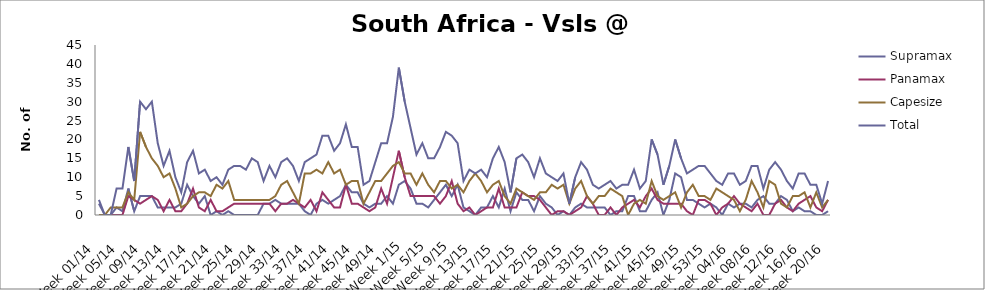
| Category | Supramax | Panamax | Capesize | Total |
|---|---|---|---|---|
| Week 01/14 | 3 | 0 | 0 | 4 |
| Week 02/14 | 0 | 0 | 0 | 0 |
| Week 03/14 | 0 | 0 | 2 | 0 |
| Week 04/14 | 2 | 0 | 2 | 7 |
| Week 05/14 | 1 | 0 | 2 | 7 |
| Week 06/14 | 7 | 5 | 6 | 18 |
| Week 07/14 | 1 | 4 | 4 | 9 |
| Week 08/14 | 5 | 3 | 22 | 30 |
| Week 09/14 | 5 | 4 | 18 | 28 |
| Week 10/14 | 5 | 5 | 15 | 30 |
| Week 11/14 | 2 | 4 | 13 | 19 |
| Week 12/14 | 2 | 1 | 10 | 13 |
| Week 13/14 | 2 | 4 | 11 | 17 |
| Week 14/14 | 2 | 1 | 7 | 10 |
| Week 15/14 | 3 | 1 | 2 | 6 |
| Week 16/14 | 8 | 3 | 3 | 14 |
| Week 17/14 | 5 | 7 | 5 | 17 |
| Week 18/14 | 3 | 2 | 6 | 11 |
| Week 19/14 | 5 | 1 | 6 | 12 |
| Week 20/14 | 0 | 4 | 5 | 9 |
| Week 21/14 | 1 | 1 | 8 | 10 |
| Week 22/14 | 0 | 1 | 7 | 8 |
| Week 23/14 | 1 | 2 | 9 | 12 |
| Week 24/14 | 0 | 3 | 4 | 13 |
| Week 25/14 | 0 | 3 | 4 | 13 |
| Week 26/14 | 0 | 3 | 4 | 12 |
| Week 27/14 | 0 | 3 | 4 | 15 |
| Week 28/14 | 0 | 3 | 4 | 14 |
| Week 29/14 | 3 | 3 | 4 | 9 |
| Week 30/14 | 3 | 3 | 4 | 13 |
| Week 31/14 | 4 | 1 | 5 | 10 |
| Week 32/14 | 3 | 3 | 8 | 14 |
| Week 33/14 | 3 | 3 | 9 | 15 |
| Week 34/14 | 3 | 4 | 6 | 13 |
| Week 35/14 | 3 | 3 | 3 | 9 |
| Week 36/14 | 1 | 2 | 11 | 14 |
| Week 37/14 | 0 | 4 | 11 | 15 |
| Week 38/14 | 3 | 1 | 12 | 16 |
| Week 39/14 | 4 | 6 | 11 | 21 |
| Week 40/14 | 3 | 4 | 14 | 21 |
| Week 41/14 | 4 | 2 | 11 | 17 |
| Week 42/14 | 5 | 2 | 12 | 19 |
| Week 43/14 | 8 | 8 | 8 | 24 |
| Week 44/14 | 6 | 3 | 9 | 18 |
| Week 45/14 | 6 | 3 | 9 | 18 |
| Week 46/14 | 3 | 2 | 3 | 8 |
| Week 47/14 | 2 | 1 | 6 | 9 |
| Week 48/14 | 3 | 2 | 9 | 14 |
| Week 49/14 | 3 | 7 | 9 | 19 |
| Week 50/14 | 5 | 3 | 11 | 19 |
| Week 51/14 | 3 | 10 | 13 | 26 |
| Week 52/14 | 8 | 17 | 14 | 39 |
| Week 1/15 | 9 | 10 | 11 | 30 |
| Week 2/15 | 7 | 5 | 11 | 23 |
| Week 3/15 | 3 | 5 | 8 | 16 |
| Week 4/15 | 3 | 5 | 11 | 19 |
| Week 5/15 | 2 | 5 | 8 | 15 |
| Week 6/15 | 4 | 5 | 6 | 15 |
| Week 7/15 | 6 | 3 | 9 | 18 |
| Week 8/15 | 8 | 5 | 9 | 22 |
| Week 9/15 | 5 | 9 | 7 | 21 |
| Week 10/15 | 8 | 3 | 8 | 19 |
| Week 11/15 | 2 | 1 | 6 | 9 |
| Week 12/15 | 1 | 2 | 9 | 12 |
| Week 13/15 | 0 | 0 | 11 | 11 |
| Week 14/15 | 2 | 1 | 9 | 12 |
| Week 15/15 | 2 | 2 | 6 | 10 |
| Week 16/15 | 5 | 2 | 8 | 15 |
| Week 17/15 | 2 | 7 | 9 | 18 |
| Week 18/15 | 7 | 2 | 5 | 14 |
| Week 19/15 | 1 | 2 | 3 | 6 |
| Week 20/15 | 6 | 2 | 7 | 15 |
| Week 21/15 | 4 | 6 | 6 | 16 |
| Week 22/15 | 4 | 5 | 5 | 14 |
| Week 23/15 | 1 | 5 | 4 | 10 |
| Week 24/15 | 5 | 4 | 6 | 15 |
| Week 25/15 | 3 | 2 | 6 | 11 |
| Week 26/15 | 2 | 0 | 8 | 10 |
| Week 27/15 | 0 | 1 | 7 | 9 |
| Week 28/15 | 1 | 1 | 8 | 11 |
| Week 29/15 | 0 | 0 | 3 | 3 |
| Week 30/15 | 2 | 1 | 7 | 10 |
| Week 31/15 | 3 | 2 | 9 | 14 |
| Week 32/15 | 2 | 5 | 5 | 12 |
| Week 33/15 | 2 | 3 | 3 | 8 |
| Week 34/15 | 2 | 0 | 5 | 7 |
| Week 35/15 | 2 | 0 | 5 | 8 |
| Week 36/15 | 0 | 2 | 7 | 9 |
| Week 37/15 | 1 | 0 | 6 | 7 |
| Week 38/15 | 1 | 2 | 5 | 8 |
| Week 39/15 | 5 | 3 | 0 | 8 |
| Week 40/15 | 5 | 4 | 3 | 12 |
| Week 41/15 | 1 | 2 | 4 | 7 |
| Week 42/15 | 1 | 5 | 3 | 9 |
| Week 43/15 | 4 | 7 | 9 | 20 |
| Week 44/15 | 6 | 4 | 5 | 16 |
| Week 45/15 | 0 | 3 | 4 | 8 |
| Week 46/15 | 4 | 3 | 5 | 13 |
| Week 47/15 | 11 | 3 | 6 | 20 |
| Week 48/15 | 10 | 3 | 2 | 15 |
| Week 49/15 | 4 | 1 | 6 | 11 |
| Week 50/15 | 4 | 0 | 8 | 12 |
| Week 51/15 | 3 | 4 | 5 | 13 |
| Week 52/15 | 2 | 4 | 5 | 13 |
| Week 53/15 | 3 | 3 | 4 | 11 |
| Week 01/16 | 2 | 0 | 7 | 9 |
| Week 02/16 | 0 | 2 | 6 | 8 |
| Week 03/16 | 3 | 3 | 5 | 11 |
| Week 04/16 | 2 | 5 | 4 | 11 |
| Week 05/16 | 3 | 3 | 1 | 8 |
| Week 06/16 | 3 | 2 | 4 | 9 |
| Week 07/16 | 2 | 1 | 9 | 13 |
| Week 08/16 | 4 | 3 | 6 | 13 |
| Week 09/16 | 5 | 0 | 2 | 7 |
| Week 10/16 | 3 | 0 | 9 | 12 |
| Week 11/16 | 3 | 3 | 8 | 14 |
| Week 12/16 | 5 | 4 | 3 | 12 |
| Week 13/16 | 4 | 2 | 2 | 9 |
| Week 14/16 | 1 | 1 | 5 | 7 |
| Week 15/16 | 2 | 3 | 5 | 11 |
| Week 16/16 | 1 | 4 | 6 | 11 |
| Week 17/16 | 1 | 5 | 2 | 8 |
| Week 18/16 | 0 | 2 | 6 | 8 |
| Week 19/16 | 0 | 1 | 2 | 3 |
| Week 20/16 | 1 | 4 | 4 | 9 |